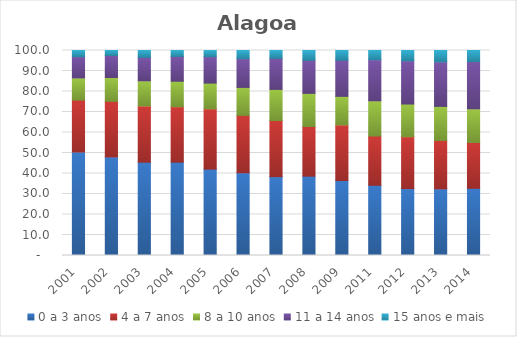
| Category | 0 a 3 anos | 4 a 7 anos | 8 a 10 anos | 11 a 14 anos | 15 anos e mais |
|---|---|---|---|---|---|
| 2001.0 | 50.49 | 25.31 | 10.8 | 10.42 | 2.99 |
| 2002.0 | 48.08 | 27.12 | 11.64 | 10.74 | 2.42 |
| 2003.0 | 45.51 | 27.45 | 12.23 | 11.44 | 3.37 |
| 2004.0 | 45.54 | 27.05 | 12.41 | 12.09 | 2.92 |
| 2005.0 | 42.13 | 29.44 | 12.53 | 12.92 | 2.98 |
| 2006.0 | 40.36 | 28 | 13.64 | 14.02 | 3.97 |
| 2007.0 | 38.48 | 27.36 | 15.19 | 15.14 | 3.83 |
| 2008.0 | 38.69 | 24.24 | 16.16 | 16.11 | 4.8 |
| 2009.0 | 36.57 | 27.14 | 13.92 | 17.63 | 4.74 |
| 2011.0 | 34.25 | 24.04 | 17.16 | 20.06 | 4.49 |
| 2012.0 | 32.66 | 25.28 | 15.94 | 21.13 | 4.99 |
| 2013.0 | 32.52 | 23.6 | 16.62 | 21.74 | 5.52 |
| 2014.0 | 32.77 | 22.37 | 16.4 | 23.07 | 5.39 |